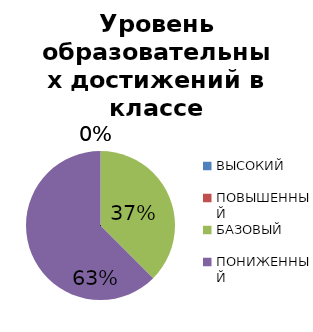
| Category | Series 0 |
|---|---|
| ВЫСОКИЙ | 0 |
| ПОВЫШЕННЫЙ | 0 |
| БАЗОВЫЙ | 9.091 |
| ПОНИЖЕННЫЙ | 15.152 |